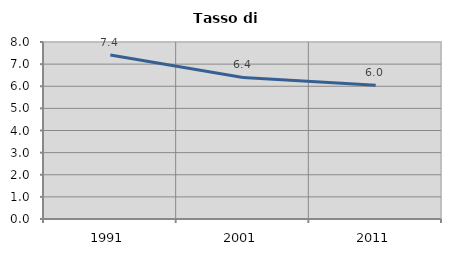
| Category | Tasso di disoccupazione   |
|---|---|
| 1991.0 | 7.416 |
| 2001.0 | 6.398 |
| 2011.0 | 6.044 |